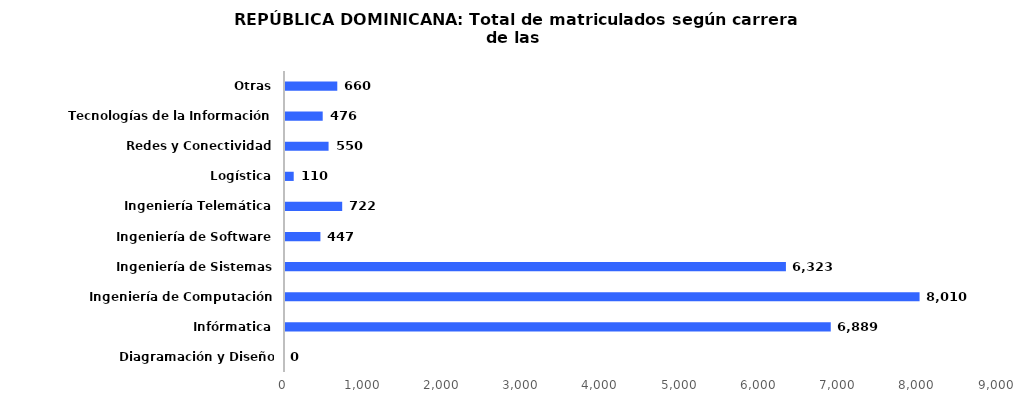
| Category | Series 0 |
|---|---|
| Diagramación y Diseño Informático | 0 |
| Infórmatica | 6889 |
| Ingeniería de Computación | 8010 |
| Ingeniería de Sistemas | 6323 |
| Ingeniería de Software | 447 |
| Ingeniería Telemática | 722 |
| Logística | 110 |
| Redes y Conectividad | 550 |
| Tecnologías de la Información | 476 |
| Otras | 660 |